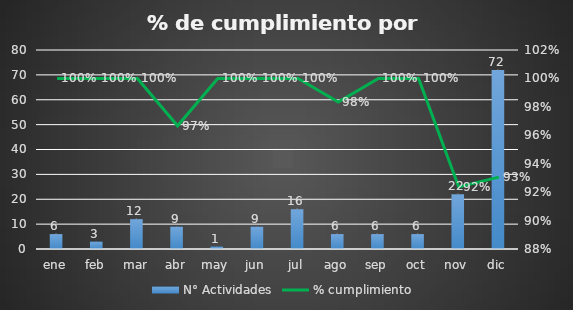
| Category | N° Actividades |
|---|---|
| ene | 6 |
| feb | 3 |
| mar | 12 |
| abr | 9 |
| may | 1 |
| jun | 9 |
| jul | 16 |
| ago | 6 |
| sep | 6 |
| oct | 6 |
| nov | 22 |
| dic | 72 |